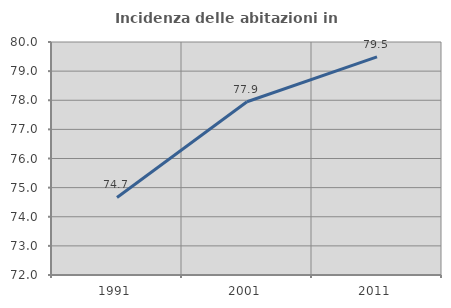
| Category | Incidenza delle abitazioni in proprietà  |
|---|---|
| 1991.0 | 74.663 |
| 2001.0 | 77.948 |
| 2011.0 | 79.49 |